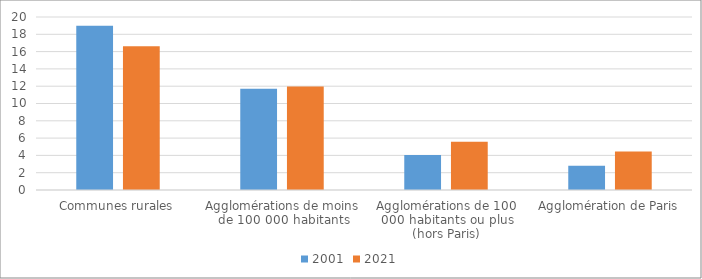
| Category | 2001 | 2021 |
|---|---|---|
| Communes rurales | 19.002 | 16.61 |
| Agglomérations de moins de 100 000 habitants | 11.694 | 11.964 |
| Agglomérations de 100 000 habitants ou plus (hors Paris) | 4.049 | 5.571 |
| Agglomération de Paris | 2.815 | 4.441 |